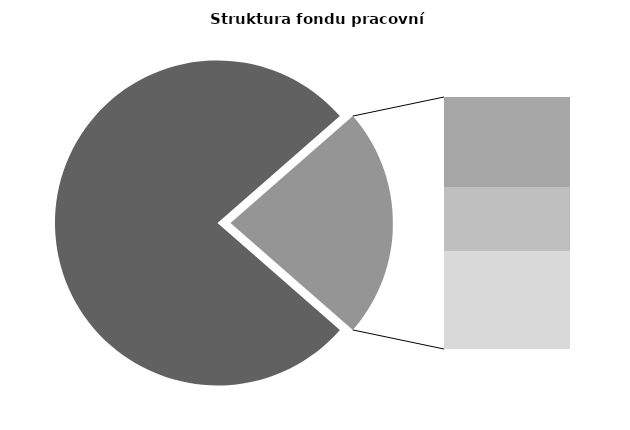
| Category | Series 0 |
|---|---|
| Průměrná měsíční odpracovaná doba bez přesčasu | 131.061 |
| Dovolená | 14.005 |
| Nemoc | 9.815 |
| Jiné | 15.027 |